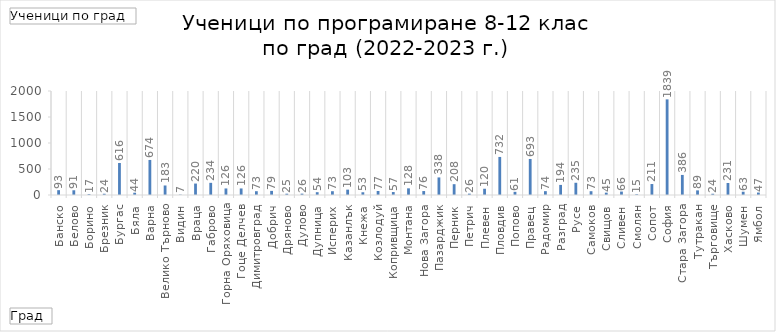
| Category | Total |
|---|---|
| Банско | 93 |
| Белово | 91 |
| Борино | 17 |
| Брезник | 24 |
| Бургас | 616 |
| Бяла | 44 |
| Варна | 674 |
| Велико Търново | 183 |
| Видин | 7 |
| Враца | 220 |
| Габрово | 234 |
| Горна Оряховица | 126 |
| Гоце Делчев | 126 |
| Димитровград | 73 |
| Добрич | 79 |
| Дряново | 25 |
| Дулово | 26 |
| Дупница | 54 |
| Исперих | 73 |
| Казанлък | 103 |
| Кнежа | 53 |
| Козлодуй | 77 |
| Копривщица | 57 |
| Монтана | 128 |
| Нова Загора | 76 |
| Пазарджик | 338 |
| Перник | 208 |
| Петрич | 26 |
| Плевен | 120 |
| Пловдив | 732 |
| Попово | 61 |
| Правец | 693 |
| Радомир | 74 |
| Разград | 194 |
| Русе | 235 |
| Самоков | 73 |
| Свищов | 45 |
| Сливен | 66 |
| Смолян | 15 |
| Сопот | 211 |
| София | 1839 |
| Стара Загора | 386 |
| Тутракан | 89 |
| Търговище | 24 |
| Хасково | 231 |
| Шумен | 63 |
| Ямбол | 47 |